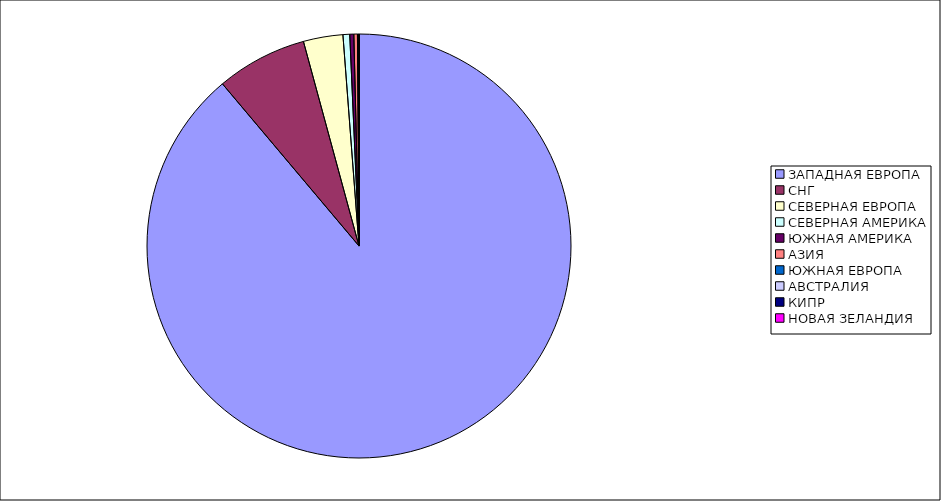
| Category | Оборот |
|---|---|
| ЗАПАДНАЯ ЕВРОПА | 0.889 |
| СНГ | 0.069 |
| СЕВЕРНАЯ ЕВРОПА | 0.03 |
| СЕВЕРНАЯ АМЕРИКА | 0.005 |
| ЮЖНАЯ АМЕРИКА | 0.003 |
| АЗИЯ | 0.003 |
| ЮЖНАЯ ЕВРОПА | 0.001 |
| АВСТРАЛИЯ | 0 |
| КИПР | 0 |
| НОВАЯ ЗЕЛАНДИЯ | 0 |